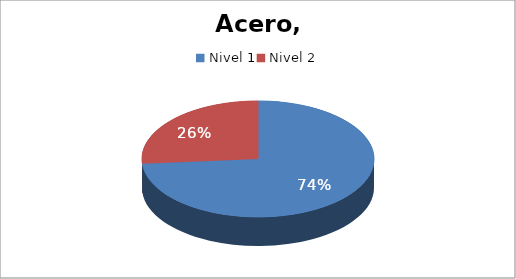
| Category | Act. |
|---|---|
| Nivel 1 | 28 |
| Nivel 2 | 10 |